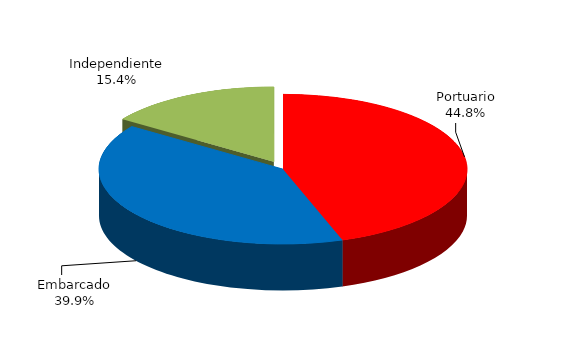
| Category | Series 0 |
|---|---|
| Portuario | 137 |
| Embarcado | 122 |
| Independiente | 47 |